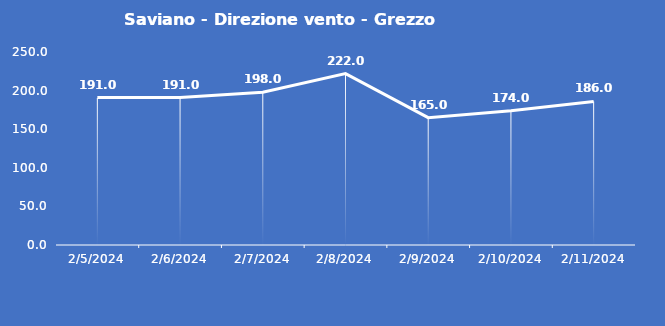
| Category | Saviano - Direzione vento - Grezzo (°N) |
|---|---|
| 2/5/24 | 191 |
| 2/6/24 | 191 |
| 2/7/24 | 198 |
| 2/8/24 | 222 |
| 2/9/24 | 165 |
| 2/10/24 | 174 |
| 2/11/24 | 186 |